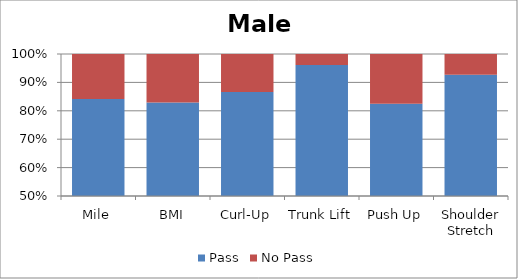
| Category | Pass | No Pass |
|---|---|---|
| Mile | 600 | 113 |
| BMI | 549 | 113 |
| Curl-Up | 698 | 108 |
| Trunk Lift | 791 | 32 |
| Push Up | 631 | 134 |
| Shoulder Stretch | 772 | 61 |